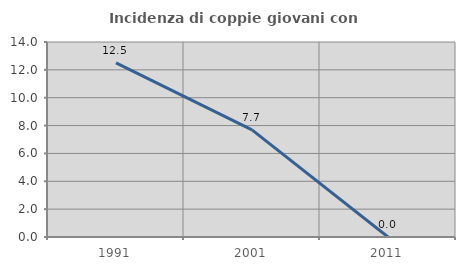
| Category | Incidenza di coppie giovani con figli |
|---|---|
| 1991.0 | 12.5 |
| 2001.0 | 7.692 |
| 2011.0 | 0 |